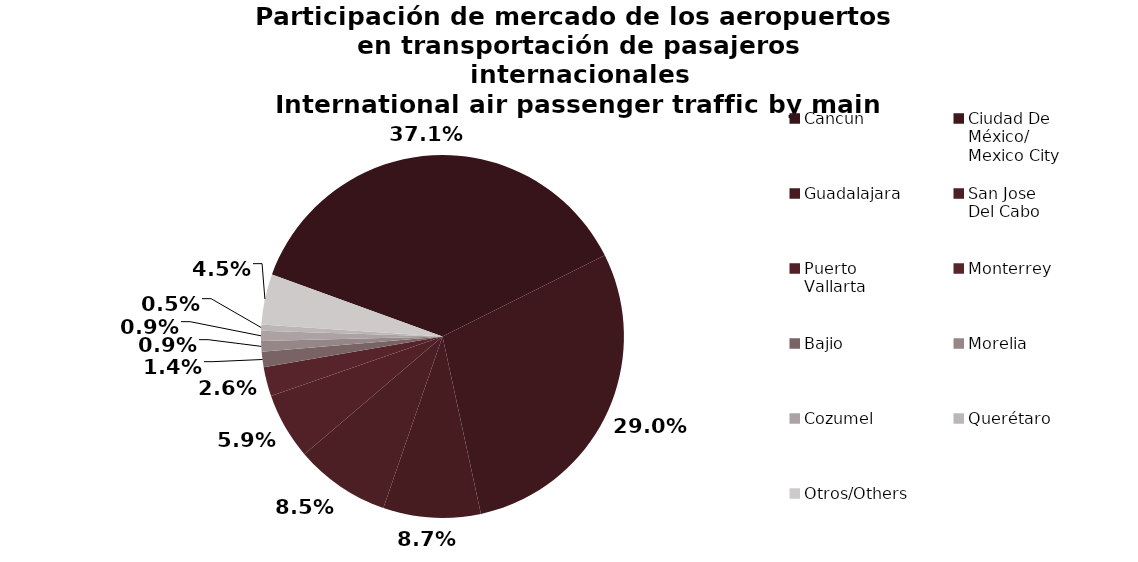
| Category | Series 0 |
|---|---|
| Cancun | 1589.007 |
| Ciudad De 
México/
Mexico City | 1243.148 |
| Guadalajara | 372.225 |
| San Jose 
Del Cabo | 363.802 |
| Puerto 
Vallarta | 253.447 |
| Monterrey | 112.05 |
| Bajio | 59.002 |
| Morelia | 40.31 |
| Cozumel | 39.031 |
| Querétaro | 23.065 |
| Otros/Others | 193.089 |